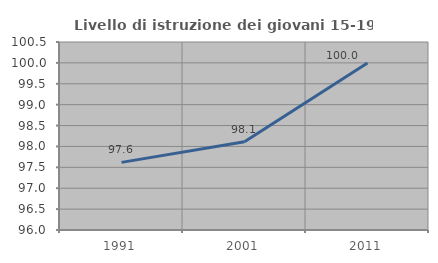
| Category | Livello di istruzione dei giovani 15-19 anni |
|---|---|
| 1991.0 | 97.619 |
| 2001.0 | 98.113 |
| 2011.0 | 100 |